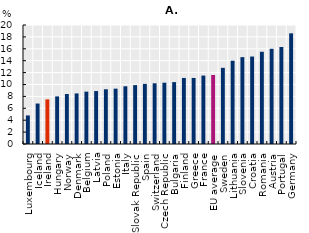
| Category | Engineering |
|---|---|
| Luxembourg | 4.8 |
| Iceland | 6.8 |
| Ireland | 7.5 |
| Hungary | 8 |
| Norway | 8.4 |
| Denmark | 8.5 |
| Belgium | 8.8 |
| Latvia | 8.9 |
| Poland | 9.2 |
| Estonia | 9.3 |
| Italy | 9.7 |
| Slovak Republic | 9.9 |
| Spain | 10.1 |
| Switzerland | 10.2 |
| Czech Republic | 10.3 |
| Bulgaria | 10.4 |
| Finland | 11.1 |
| Greece | 11.1 |
| France | 11.5 |
| EU average | 11.6 |
| Sweden | 12.8 |
| Lithuania | 14 |
| Slovenia | 14.6 |
| Croatia | 14.7 |
| Romania | 15.5 |
| Austria | 16 |
| Portugal | 16.3 |
| Germany | 18.6 |